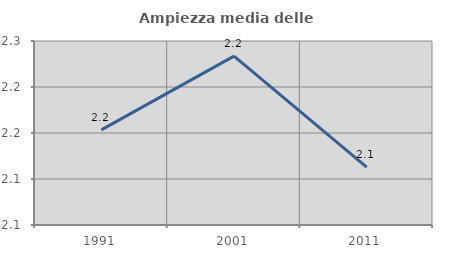
| Category | Ampiezza media delle famiglie |
|---|---|
| 1991.0 | 2.153 |
| 2001.0 | 2.234 |
| 2011.0 | 2.113 |